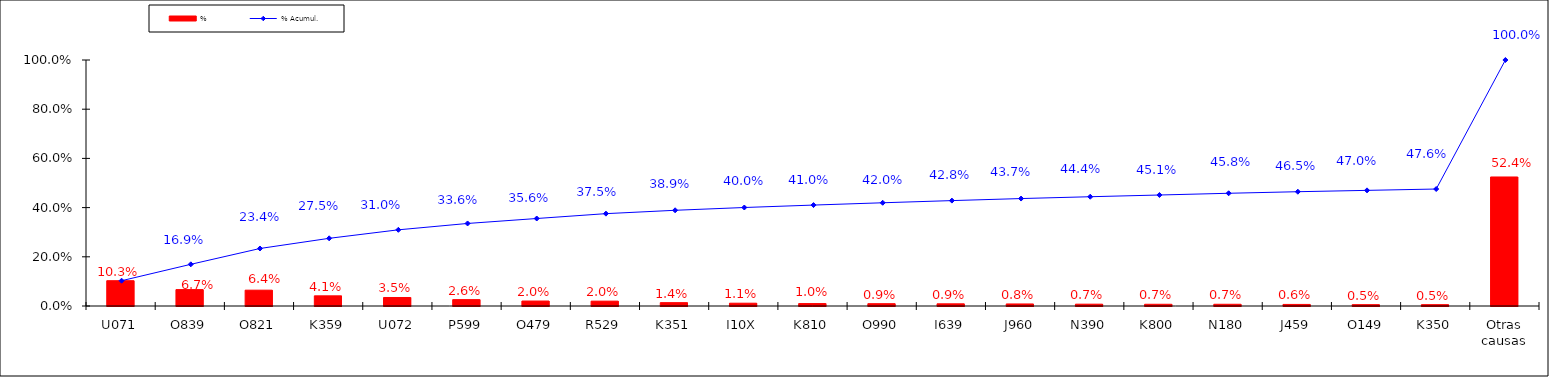
| Category | % |
|---|---|
| U071 | 0.103 |
| O839 | 0.067 |
| O821 | 0.064 |
| K359 | 0.041 |
| U072 | 0.035 |
| P599 | 0.026 |
| O479 | 0.02 |
| R529 | 0.02 |
| K351 | 0.014 |
| I10X | 0.011 |
| K810 | 0.01 |
| O990 | 0.009 |
| I639 | 0.009 |
| J960 | 0.008 |
| N390 | 0.007 |
| K800 | 0.007 |
| N180 | 0.007 |
| J459 | 0.006 |
| O149 | 0.005 |
| K350 | 0.005 |
| Otras causas | 0.524 |